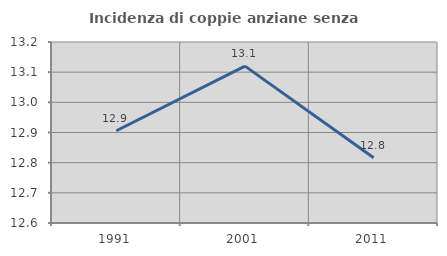
| Category | Incidenza di coppie anziane senza figli  |
|---|---|
| 1991.0 | 12.906 |
| 2001.0 | 13.12 |
| 2011.0 | 12.816 |